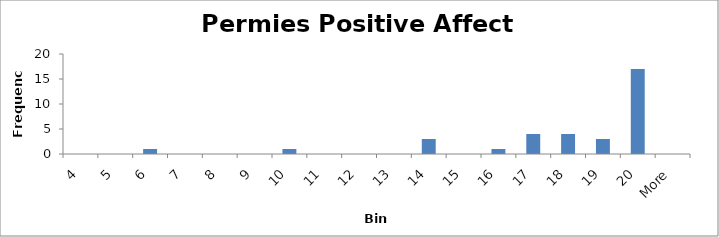
| Category | Frequency |
|---|---|
| 4 | 0 |
| 5 | 0 |
| 6 | 1 |
| 7 | 0 |
| 8 | 0 |
| 9 | 0 |
| 10 | 1 |
| 11 | 0 |
| 12 | 0 |
| 13 | 0 |
| 14 | 3 |
| 15 | 0 |
| 16 | 1 |
| 17 | 4 |
| 18 | 4 |
| 19 | 3 |
| 20 | 17 |
| More | 0 |